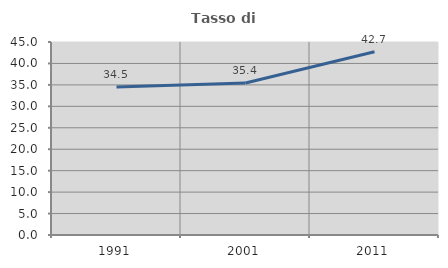
| Category | Tasso di occupazione   |
|---|---|
| 1991.0 | 34.525 |
| 2001.0 | 35.444 |
| 2011.0 | 42.72 |